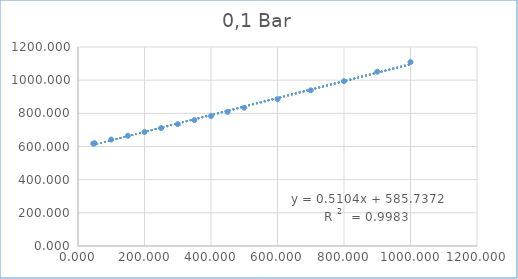
| Category | Series 0 |
|---|---|
| 45.8 | 617.272 |
| 50.0 | 619.207 |
| 100.0 | 642.021 |
| 150.0 | 664.835 |
| 200.0 | 687.912 |
| 250.0 | 711.276 |
| 300.0 | 734.998 |
| 350.0 | 759.078 |
| 400.0 | 783.54 |
| 450.0 | 808.409 |
| 500.0 | 833.66 |
| 600.0 | 885.404 |
| 700.0 | 938.82 |
| 800.0 | 993.932 |
| 900.0 | 1050.717 |
| 1000.0 | 1109.126 |